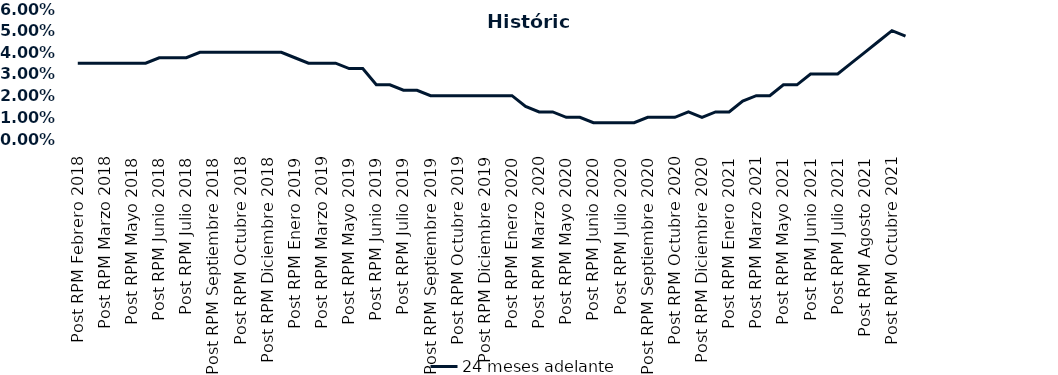
| Category | 24 meses adelante  |
|---|---|
| Post RPM Febrero 2018 | 0.035 |
| Pre RPM Marzo 2018 | 0.035 |
| Post RPM Marzo 2018 | 0.035 |
| Pre RPM Mayo 2018 | 0.035 |
| Post RPM Mayo 2018 | 0.035 |
| Pre RPM Junio 2018 | 0.035 |
| Post RPM Junio 2018 | 0.038 |
| Pre RPM Julio 2018 | 0.038 |
| Post RPM Julio 2018 | 0.038 |
| Pre RPM Septiembre 2018 | 0.04 |
| Post RPM Septiembre 2018 | 0.04 |
| Pre RPM Octubre 2018 | 0.04 |
| Post RPM Octubre 2018 | 0.04 |
| Pre RPM Diciembre 2018 | 0.04 |
| Post RPM Diciembre 2018 | 0.04 |
| Pre RPM Enero 2019 | 0.04 |
| Post RPM Enero 2019 | 0.038 |
| Pre RPM Marzo 2019 | 0.035 |
| Post RPM Marzo 2019 | 0.035 |
| Pre RPM Mayo 2019 | 0.035 |
| Post RPM Mayo 2019 | 0.032 |
| Pre RPM Junio 2019 | 0.032 |
| Post RPM Junio 2019 | 0.025 |
| Pre RPM Julio 2019 | 0.025 |
| Post RPM Julio 2019 | 0.022 |
| Pre RPM Septiembre 2019 | 0.022 |
| Post RPM Septiembre 2019 | 0.02 |
| Pre RPM Octubre 2019 | 0.02 |
| Post RPM Octubre 2019 | 0.02 |
| Pre RPM Diciembre 2019 | 0.02 |
| Post RPM Diciembre 2019 | 0.02 |
| Pre RPM Enero 2020 | 0.02 |
| Post RPM Enero 2020 | 0.02 |
| Pre RPM Marzo 2020 | 0.015 |
| Post RPM Marzo 2020 | 0.012 |
| Pre RPM Mayo 2020 | 0.012 |
| Post RPM Mayo 2020 | 0.01 |
| Pre RPM Junio 2020 | 0.01 |
| Post RPM Junio 2020 | 0.008 |
| Pre RPM Julio 2020 | 0.008 |
| Post RPM Julio 2020 | 0.008 |
| Pre RPM Septiembre 2020 | 0.008 |
| Post RPM Septiembre 2020 | 0.01 |
| Pre RPM Octubre 2020 | 0.01 |
| Post RPM Octubre 2020 | 0.01 |
| Pre RPM Diciembre 2020 | 0.012 |
| Post RPM Diciembre 2020 | 0.01 |
| Pre RPM Enero 2021 | 0.012 |
| Post RPM Enero 2021 | 0.012 |
| Pre RPM Marzo 2021 | 0.018 |
| Post RPM Marzo 2021 | 0.02 |
| Pre RPM Mayo 2021 | 0.02 |
| Post RPM Mayo 2021 | 0.025 |
| Pre RPM Junio 2021 | 0.025 |
| Post RPM Junio 2021 | 0.03 |
| Pre RPM Julio 2021 | 0.03 |
| Post RPM Julio 2021 | 0.03 |
| Pre RPM Agosto 2021 | 0.035 |
| Post RPM Agosto 2021 | 0.04 |
| Pre RPM Octubre 2021 | 0.045 |
| Post RPM Octubre 2021 | 0.05 |
| Pre RPM Diciembre 2021 | 0.048 |